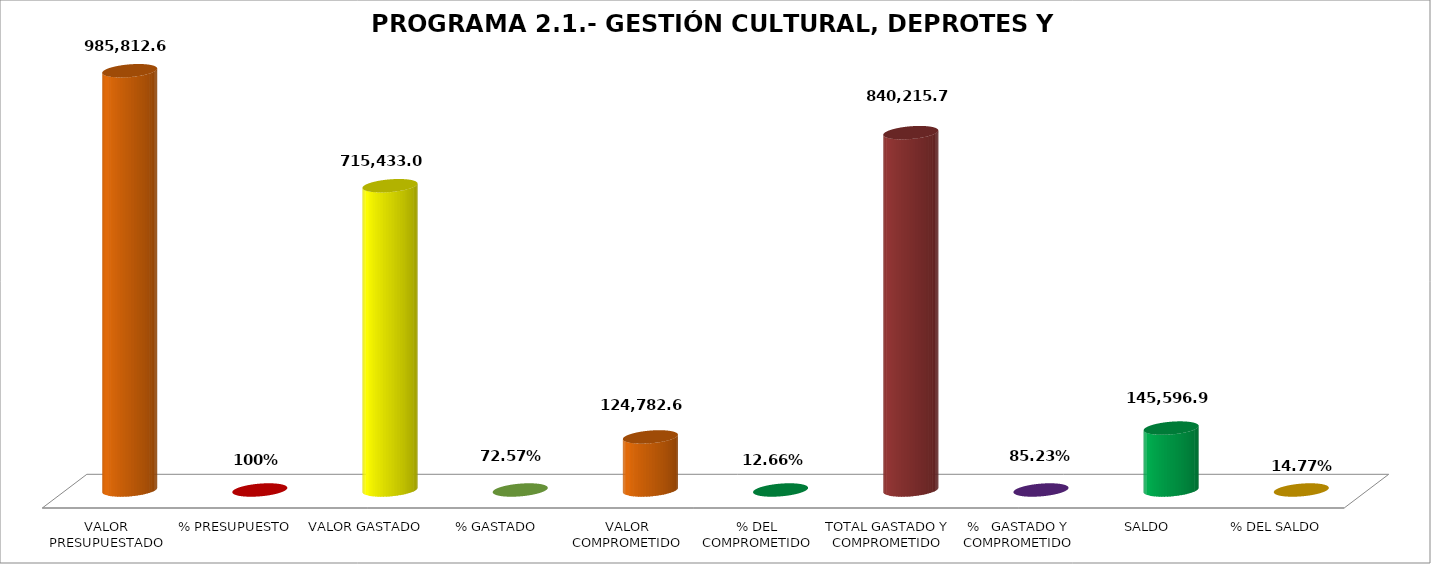
| Category | PROGRAMA 2.1.- GESTIÓN CULTURAL, DEPROTES Y RECREACIÓN |
|---|---|
| VALOR PRESUPUESTADO | 985812.69 |
| % PRESUPUESTO | 1 |
| VALOR GASTADO | 715433.03 |
| % GASTADO | 0.726 |
| VALOR COMPROMETIDO | 124782.67 |
| % DEL COMPROMETIDO | 0.127 |
| TOTAL GASTADO Y COMPROMETIDO | 840215.7 |
| %   GASTADO Y COMPROMETIDO | 0.852 |
| SALDO | 145596.99 |
| % DEL SALDO | 0.148 |